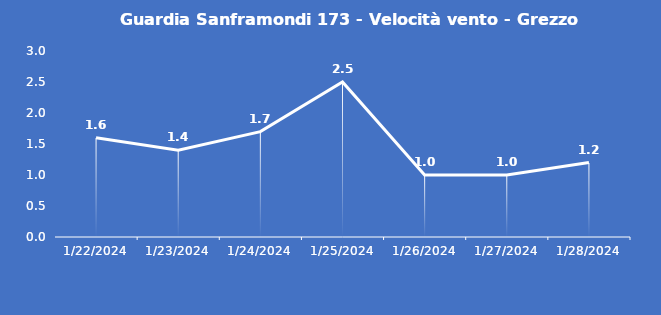
| Category | Guardia Sanframondi 173 - Velocità vento - Grezzo (m/s) |
|---|---|
| 1/22/24 | 1.6 |
| 1/23/24 | 1.4 |
| 1/24/24 | 1.7 |
| 1/25/24 | 2.5 |
| 1/26/24 | 1 |
| 1/27/24 | 1 |
| 1/28/24 | 1.2 |